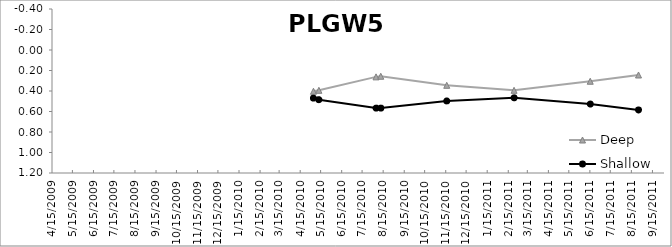
| Category | Deep | Shallow |
|---|---|---|
| 5/4/10 | 0.402 | 0.469 |
| 5/12/10 | 0.393 | 0.485 |
| 8/4/10 | 0.262 | 0.567 |
| 8/11/10 | 0.256 | 0.567 |
| 11/16/10 | 0.344 | 0.497 |
| 2/23/11 | 0.393 | 0.466 |
| 6/15/11 | 0.305 | 0.527 |
| 8/25/11 | 0.244 | 0.585 |